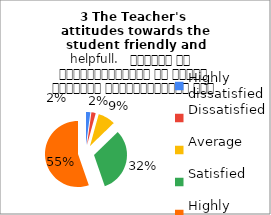
| Category | 3 The Teacher's 
attitudes towards the student friendly and helpfull.   शिक्षक का विद्यार्थियों के प्रति व्यवहार मित्रतापूर्ण एवम सहयोग के भावना से परिपूर्ण था |
|---|---|
| Highly dissatisfied | 2 |
| Dissatisfied | 2 |
| Average | 8 |
| Satisfied | 30 |
| Highly satisfied | 52 |